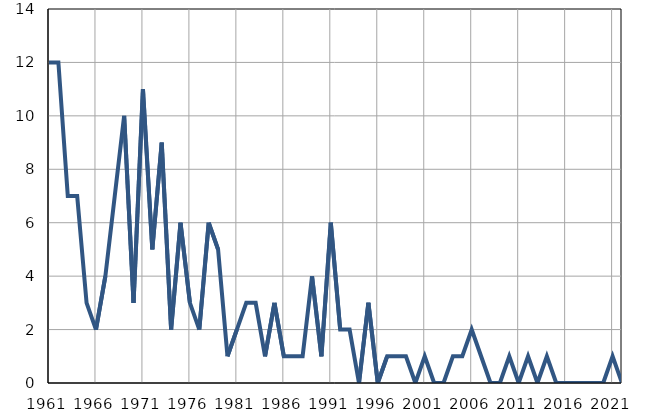
| Category | Умрла 
одојчад |
|---|---|
| 1961.0 | 12 |
| 1962.0 | 12 |
| 1963.0 | 7 |
| 1964.0 | 7 |
| 1965.0 | 3 |
| 1966.0 | 2 |
| 1967.0 | 4 |
| 1968.0 | 7 |
| 1969.0 | 10 |
| 1970.0 | 3 |
| 1971.0 | 11 |
| 1972.0 | 5 |
| 1973.0 | 9 |
| 1974.0 | 2 |
| 1975.0 | 6 |
| 1976.0 | 3 |
| 1977.0 | 2 |
| 1978.0 | 6 |
| 1979.0 | 5 |
| 1980.0 | 1 |
| 1981.0 | 2 |
| 1982.0 | 3 |
| 1983.0 | 3 |
| 1984.0 | 1 |
| 1985.0 | 3 |
| 1986.0 | 1 |
| 1987.0 | 1 |
| 1988.0 | 1 |
| 1989.0 | 4 |
| 1990.0 | 1 |
| 1991.0 | 6 |
| 1992.0 | 2 |
| 1993.0 | 2 |
| 1994.0 | 0 |
| 1995.0 | 3 |
| 1996.0 | 0 |
| 1997.0 | 1 |
| 1998.0 | 1 |
| 1999.0 | 1 |
| 2000.0 | 0 |
| 2001.0 | 1 |
| 2002.0 | 0 |
| 2003.0 | 0 |
| 2004.0 | 1 |
| 2005.0 | 1 |
| 2006.0 | 2 |
| 2007.0 | 1 |
| 2008.0 | 0 |
| 2009.0 | 0 |
| 2010.0 | 1 |
| 2011.0 | 0 |
| 2012.0 | 1 |
| 2013.0 | 0 |
| 2014.0 | 1 |
| 2015.0 | 0 |
| 2016.0 | 0 |
| 2017.0 | 0 |
| 2018.0 | 0 |
| 2019.0 | 0 |
| 2020.0 | 0 |
| 2021.0 | 1 |
| 2022.0 | 0 |